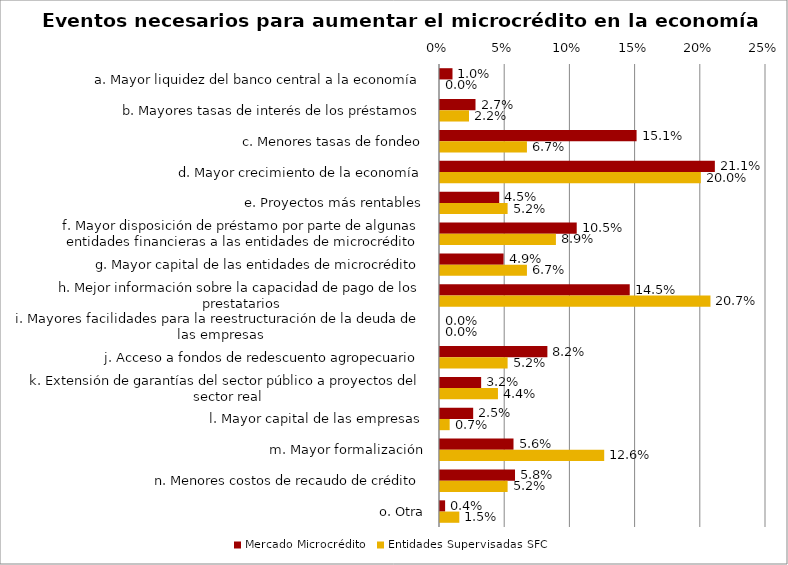
| Category | Mercado Microcrédito | Entidades Supervisadas SFC |
|---|---|---|
| a. Mayor liquidez del banco central a la economía | 0.01 | 0 |
| b. Mayores tasas de interés de los préstamos | 0.027 | 0.022 |
| c. Menores tasas de fondeo | 0.151 | 0.067 |
| d. Mayor crecimiento de la economía | 0.211 | 0.2 |
| e. Proyectos más rentables | 0.045 | 0.052 |
| f. Mayor disposición de préstamo por parte de algunas entidades financieras a las entidades de microcrédito | 0.105 | 0.089 |
| g. Mayor capital de las entidades de microcrédito | 0.049 | 0.067 |
| h. Mejor información sobre la capacidad de pago de los prestatarios | 0.145 | 0.207 |
| i. Mayores facilidades para la reestructuración de la deuda de las empresas | 0 | 0 |
| j. Acceso a fondos de redescuento agropecuario | 0.082 | 0.052 |
| k. Extensión de garantías del sector público a proyectos del sector real | 0.032 | 0.044 |
| l. Mayor capital de las empresas | 0.025 | 0.007 |
| m. Mayor formalización | 0.056 | 0.126 |
| n. Menores costos de recaudo de crédito | 0.058 | 0.052 |
| o. Otra | 0.004 | 0.015 |